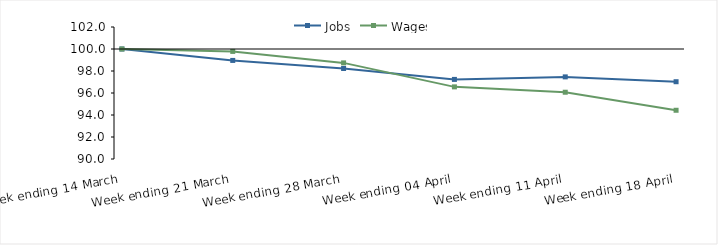
| Category | Jobs | Wages |
|---|---|---|
| 0 | 100 | 100 |
| 1900-01-01 | 98.961 | 99.782 |
| 1900-01-02 | 98.229 | 98.737 |
| 1900-01-03 | 97.236 | 96.557 |
| 1900-01-04 | 97.465 | 96.07 |
| 1900-01-05 | 97.025 | 94.43 |